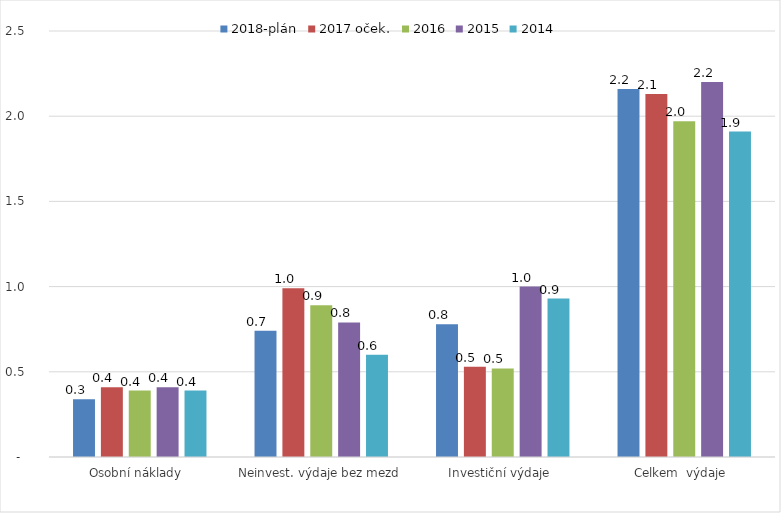
| Category | 2018-plán | 2017 oček. | 2016 | 2015 | 2014 |
|---|---|---|---|---|---|
| Osobní náklady  | 0.339 | 0.41 | 0.39 | 0.41 | 0.39 |
| Neinvest. výdaje bez mezd | 0.741 | 0.99 | 0.89 | 0.79 | 0.6 |
| Investiční výdaje  | 0.778 | 0.53 | 0.52 | 1 | 0.93 |
| Celkem  výdaje  | 2.16 | 2.13 | 1.97 | 2.2 | 1.91 |